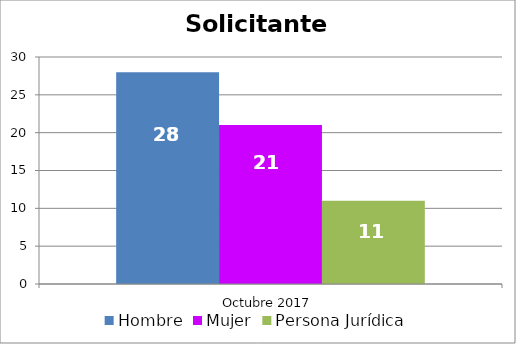
| Category | Hombre | Mujer | Persona Jurídica |
|---|---|---|---|
| Octubre 2017 | 28 | 21 | 11 |